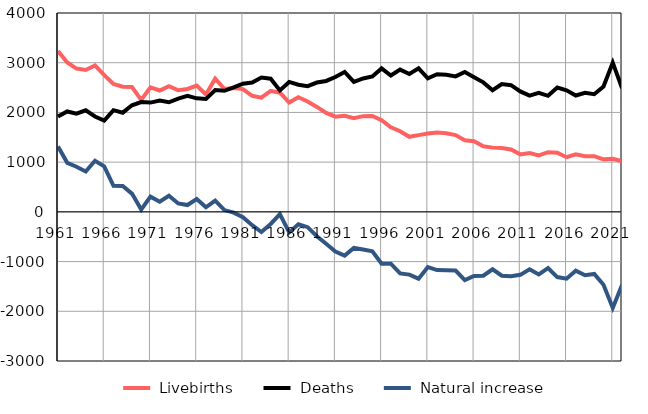
| Category |  Livebirths |  Deaths |  Natural increase |
|---|---|---|---|
| 1961.0 | 3234 | 1919 | 1315 |
| 1962.0 | 3006 | 2020 | 986 |
| 1963.0 | 2882 | 1974 | 908 |
| 1964.0 | 2855 | 2042 | 813 |
| 1965.0 | 2946 | 1919 | 1027 |
| 1966.0 | 2751 | 1836 | 915 |
| 1967.0 | 2571 | 2046 | 525 |
| 1968.0 | 2517 | 1995 | 522 |
| 1969.0 | 2511 | 2144 | 367 |
| 1970.0 | 2253 | 2208 | 45 |
| 1971.0 | 2503 | 2198 | 305 |
| 1972.0 | 2441 | 2237 | 204 |
| 1973.0 | 2529 | 2205 | 324 |
| 1974.0 | 2447 | 2278 | 169 |
| 1975.0 | 2472 | 2335 | 137 |
| 1976.0 | 2541 | 2284 | 257 |
| 1977.0 | 2361 | 2269 | 92 |
| 1978.0 | 2679 | 2452 | 227 |
| 1979.0 | 2471 | 2435 | 36 |
| 1980.0 | 2490 | 2505 | -15 |
| 1981.0 | 2469 | 2577 | -108 |
| 1982.0 | 2334 | 2602 | -268 |
| 1983.0 | 2296 | 2701 | -405 |
| 1984.0 | 2435 | 2679 | -244 |
| 1985.0 | 2397 | 2443 | -46 |
| 1986.0 | 2200 | 2613 | -413 |
| 1987.0 | 2307 | 2557 | -250 |
| 1988.0 | 2221 | 2529 | -308 |
| 1989.0 | 2111 | 2601 | -490 |
| 1990.0 | 1991 | 2633 | -642 |
| 1991.0 | 1915 | 2713 | -798 |
| 1992.0 | 1934 | 2815 | -881 |
| 1993.0 | 1886 | 2613 | -727 |
| 1994.0 | 1925 | 2684 | -759 |
| 1995.0 | 1928 | 2723 | -795 |
| 1996.0 | 1843 | 2885 | -1042 |
| 1997.0 | 1701 | 2743 | -1042 |
| 1998.0 | 1622 | 2861 | -1239 |
| 1999.0 | 1510 | 2772 | -1262 |
| 2000.0 | 1544 | 2888 | -1344 |
| 2001.0 | 1578 | 2687 | -1109 |
| 2002.0 | 1597 | 2768 | -1171 |
| 2003.0 | 1581 | 2757 | -1176 |
| 2004.0 | 1544 | 2725 | -1181 |
| 2005.0 | 1440 | 2812 | -1372 |
| 2006.0 | 1419 | 2708 | -1289 |
| 2007.0 | 1320 | 2605 | -1285 |
| 2008.0 | 1292 | 2447 | -1155 |
| 2009.0 | 1285 | 2570 | -1285 |
| 2010.0 | 1254 | 2548 | -1294 |
| 2011.0 | 1156 | 2423 | -1267 |
| 2012.0 | 1182 | 2338 | -1156 |
| 2013.0 | 1137 | 2396 | -1259 |
| 2014.0 | 1201 | 2334 | -1133 |
| 2015.0 | 1190 | 2502 | -1312 |
| 2016.0 | 1099 | 2444 | -1345 |
| 2017.0 | 1158 | 2341 | -1183 |
| 2018.0 | 1119 | 2394 | -1275 |
| 2019.0 | 1119 | 2367 | -1248 |
| 2020.0 | 1056 | 2523 | -1467 |
| 2021.0 | 1069 | 3002 | -1933 |
| 2022.0 | 1020 | 2490 | -1470 |